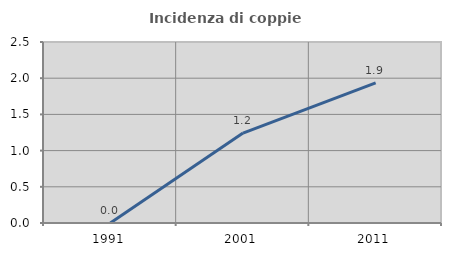
| Category | Incidenza di coppie miste |
|---|---|
| 1991.0 | 0 |
| 2001.0 | 1.242 |
| 2011.0 | 1.935 |